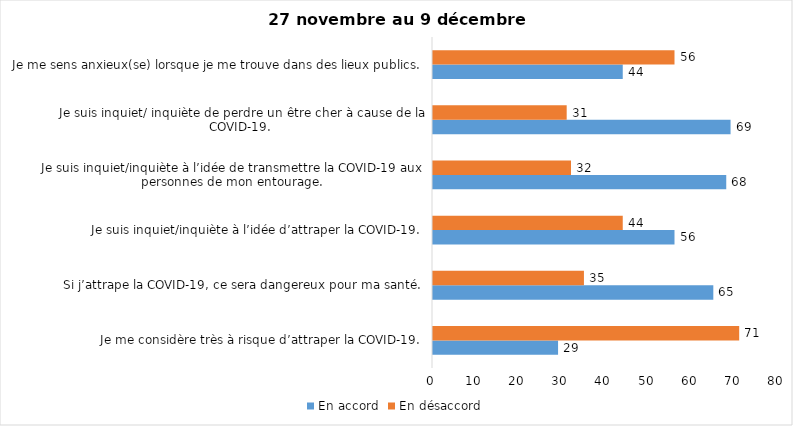
| Category | En accord | En désaccord |
|---|---|---|
| Je me considère très à risque d’attraper la COVID-19. | 29 | 71 |
| Si j’attrape la COVID-19, ce sera dangereux pour ma santé. | 65 | 35 |
| Je suis inquiet/inquiète à l’idée d’attraper la COVID-19. | 56 | 44 |
| Je suis inquiet/inquiète à l’idée de transmettre la COVID-19 aux personnes de mon entourage. | 68 | 32 |
| Je suis inquiet/ inquiète de perdre un être cher à cause de la COVID-19. | 69 | 31 |
| Je me sens anxieux(se) lorsque je me trouve dans des lieux publics. | 44 | 56 |